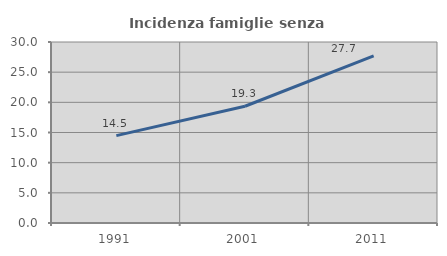
| Category | Incidenza famiglie senza nuclei |
|---|---|
| 1991.0 | 14.486 |
| 2001.0 | 19.348 |
| 2011.0 | 27.704 |